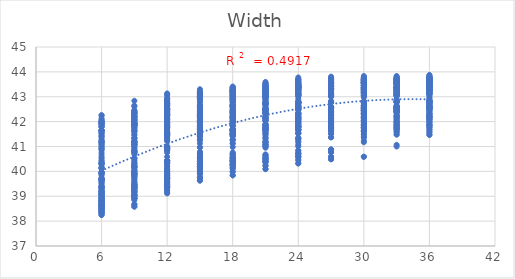
| Category | UTCI |
|---|---|
| 6.0 | 41.801 |
| 9.0 | 42.354 |
| 12.0 | 42.436 |
| 15.0 | 42.552 |
| 18.0 | 42.621 |
| 21.0 | 42.715 |
| 24.0 | 42.77 |
| 27.0 | 42.775 |
| 30.0 | 42.787 |
| 33.0 | 42.786 |
| 36.0 | 42.8 |
| 6.0 | 40.906 |
| 9.0 | 41.915 |
| 12.0 | 42.115 |
| 15.0 | 42.474 |
| 18.0 | 42.911 |
| 21.0 | 43.022 |
| 24.0 | 43.104 |
| 27.0 | 43.135 |
| 30.0 | 43.232 |
| 33.0 | 43.233 |
| 36.0 | 43.259 |
| 6.0 | 40.328 |
| 9.0 | 41.163 |
| 12.0 | 41.752 |
| 15.0 | 42.249 |
| 18.0 | 42.954 |
| 21.0 | 43.087 |
| 24.0 | 43.181 |
| 27.0 | 43.562 |
| 30.0 | 43.586 |
| 33.0 | 43.605 |
| 36.0 | 43.638 |
| 6.0 | 39.941 |
| 9.0 | 40.753 |
| 12.0 | 41.462 |
| 15.0 | 41.677 |
| 18.0 | 42.173 |
| 21.0 | 42.326 |
| 24.0 | 42.743 |
| 27.0 | 43.111 |
| 30.0 | 43.162 |
| 33.0 | 43.194 |
| 36.0 | 43.397 |
| 6.0 | 39.65 |
| 9.0 | 40.148 |
| 12.0 | 40.839 |
| 15.0 | 41.442 |
| 18.0 | 41.636 |
| 21.0 | 41.829 |
| 24.0 | 42.291 |
| 27.0 | 42.379 |
| 30.0 | 42.444 |
| 33.0 | 42.779 |
| 36.0 | 43.118 |
| 6.0 | 38.899 |
| 9.0 | 39.919 |
| 12.0 | 40.321 |
| 15.0 | 40.58 |
| 18.0 | 41.447 |
| 21.0 | 41.664 |
| 24.0 | 41.808 |
| 27.0 | 42.223 |
| 30.0 | 42.318 |
| 33.0 | 42.383 |
| 36.0 | 42.71 |
| 6.0 | 38.765 |
| 9.0 | 39.451 |
| 12.0 | 40.1 |
| 15.0 | 40.396 |
| 18.0 | 41.278 |
| 21.0 | 41.495 |
| 24.0 | 41.667 |
| 27.0 | 41.762 |
| 30.0 | 42.188 |
| 33.0 | 42.239 |
| 36.0 | 42.303 |
| 6.0 | 38.645 |
| 9.0 | 39.325 |
| 12.0 | 39.914 |
| 15.0 | 40.198 |
| 18.0 | 40.457 |
| 21.0 | 41.036 |
| 24.0 | 41.522 |
| 27.0 | 41.642 |
| 30.0 | 41.741 |
| 33.0 | 41.837 |
| 36.0 | 42.202 |
| 6.0 | 38.536 |
| 9.0 | 39.177 |
| 12.0 | 39.746 |
| 15.0 | 40.015 |
| 18.0 | 40.269 |
| 21.0 | 40.516 |
| 24.0 | 41.062 |
| 27.0 | 41.508 |
| 30.0 | 41.613 |
| 33.0 | 41.707 |
| 36.0 | 41.798 |
| 6.0 | 38.405 |
| 9.0 | 39.055 |
| 12.0 | 39.37 |
| 15.0 | 39.889 |
| 18.0 | 40.124 |
| 21.0 | 40.391 |
| 24.0 | 40.571 |
| 27.0 | 41.369 |
| 30.0 | 41.492 |
| 33.0 | 41.584 |
| 36.0 | 41.675 |
| 6.0 | 38.334 |
| 9.0 | 38.674 |
| 12.0 | 39.249 |
| 15.0 | 39.739 |
| 18.0 | 39.994 |
| 21.0 | 40.232 |
| 24.0 | 40.455 |
| 27.0 | 40.588 |
| 30.0 | 41.375 |
| 33.0 | 41.482 |
| 36.0 | 41.572 |
| 6.0 | 38.247 |
| 9.0 | 38.587 |
| 12.0 | 39.146 |
| 15.0 | 39.629 |
| 18.0 | 39.843 |
| 21.0 | 40.092 |
| 24.0 | 40.321 |
| 27.0 | 40.488 |
| 30.0 | 40.587 |
| 33.0 | 41.068 |
| 36.0 | 41.473 |
| 6.0 | 41.948 |
| 9.0 | 42.397 |
| 12.0 | 42.508 |
| 15.0 | 42.576 |
| 18.0 | 42.635 |
| 21.0 | 42.716 |
| 24.0 | 42.768 |
| 27.0 | 42.78 |
| 30.0 | 42.79 |
| 33.0 | 42.791 |
| 36.0 | 42.802 |
| 6.0 | 41.188 |
| 9.0 | 41.885 |
| 12.0 | 42.396 |
| 15.0 | 42.662 |
| 18.0 | 43.052 |
| 21.0 | 43.035 |
| 24.0 | 43.461 |
| 27.0 | 43.497 |
| 30.0 | 43.513 |
| 33.0 | 43.521 |
| 36.0 | 43.545 |
| 6.0 | 40.34 |
| 9.0 | 41.174 |
| 12.0 | 42.086 |
| 15.0 | 42.274 |
| 18.0 | 42.68 |
| 21.0 | 43.098 |
| 24.0 | 43.359 |
| 27.0 | 43.41 |
| 30.0 | 43.597 |
| 33.0 | 43.621 |
| 36.0 | 43.643 |
| 6.0 | 39.96 |
| 9.0 | 40.841 |
| 12.0 | 41.474 |
| 15.0 | 42.02 |
| 18.0 | 42.2 |
| 21.0 | 42.35 |
| 24.0 | 42.751 |
| 27.0 | 43.114 |
| 30.0 | 43.17 |
| 33.0 | 43.367 |
| 36.0 | 43.401 |
| 6.0 | 39.649 |
| 9.0 | 40.188 |
| 12.0 | 40.866 |
| 15.0 | 41.471 |
| 18.0 | 41.679 |
| 21.0 | 42.147 |
| 24.0 | 42.301 |
| 27.0 | 42.398 |
| 30.0 | 42.733 |
| 33.0 | 43.085 |
| 36.0 | 43.136 |
| 6.0 | 39.145 |
| 9.0 | 39.947 |
| 12.0 | 40.329 |
| 15.0 | 41.274 |
| 18.0 | 41.482 |
| 21.0 | 41.686 |
| 24.0 | 41.832 |
| 27.0 | 42.239 |
| 30.0 | 42.327 |
| 33.0 | 42.399 |
| 36.0 | 42.72 |
| 6.0 | 39.038 |
| 9.0 | 39.991 |
| 12.0 | 40.379 |
| 15.0 | 40.681 |
| 18.0 | 41.594 |
| 21.0 | 41.78 |
| 24.0 | 41.959 |
| 27.0 | 42.36 |
| 30.0 | 42.46 |
| 33.0 | 42.519 |
| 36.0 | 42.605 |
| 6.0 | 38.906 |
| 9.0 | 39.582 |
| 12.0 | 40.195 |
| 15.0 | 40.5 |
| 18.0 | 41.117 |
| 21.0 | 41.335 |
| 24.0 | 41.808 |
| 27.0 | 41.928 |
| 30.0 | 42.032 |
| 33.0 | 42.427 |
| 36.0 | 42.495 |
| 6.0 | 38.804 |
| 9.0 | 39.436 |
| 12.0 | 39.756 |
| 15.0 | 40.31 |
| 18.0 | 40.595 |
| 21.0 | 41.162 |
| 24.0 | 41.361 |
| 27.0 | 41.791 |
| 30.0 | 41.89 |
| 33.0 | 41.994 |
| 36.0 | 42.091 |
| 6.0 | 38.681 |
| 9.0 | 39.056 |
| 12.0 | 39.596 |
| 15.0 | 40.187 |
| 18.0 | 40.439 |
| 21.0 | 40.664 |
| 24.0 | 41.221 |
| 27.0 | 41.661 |
| 30.0 | 41.773 |
| 33.0 | 41.877 |
| 36.0 | 41.974 |
| 6.0 | 38.605 |
| 9.0 | 38.942 |
| 12.0 | 39.472 |
| 15.0 | 40.037 |
| 18.0 | 40.297 |
| 21.0 | 40.518 |
| 24.0 | 40.727 |
| 27.0 | 40.874 |
| 30.0 | 41.66 |
| 33.0 | 41.768 |
| 36.0 | 41.874 |
| 6.0 | 38.505 |
| 9.0 | 38.845 |
| 12.0 | 39.38 |
| 15.0 | 39.916 |
| 18.0 | 40.168 |
| 21.0 | 40.366 |
| 24.0 | 40.599 |
| 27.0 | 40.763 |
| 30.0 | 41.234 |
| 33.0 | 41.659 |
| 36.0 | 41.762 |
| 6.0 | 41.962 |
| 9.0 | 42.174 |
| 12.0 | 42.522 |
| 15.0 | 42.381 |
| 18.0 | 42.655 |
| 21.0 | 42.726 |
| 24.0 | 42.787 |
| 27.0 | 42.792 |
| 30.0 | 42.803 |
| 33.0 | 42.805 |
| 36.0 | 42.815 |
| 6.0 | 41.531 |
| 9.0 | 41.976 |
| 12.0 | 42.713 |
| 15.0 | 42.971 |
| 18.0 | 43.244 |
| 21.0 | 43.341 |
| 24.0 | 43.494 |
| 27.0 | 43.517 |
| 30.0 | 43.533 |
| 33.0 | 43.545 |
| 36.0 | 43.569 |
| 6.0 | 40.141 |
| 9.0 | 41.595 |
| 12.0 | 41.862 |
| 15.0 | 42.054 |
| 18.0 | 42.767 |
| 21.0 | 42.871 |
| 24.0 | 43.137 |
| 27.0 | 43.338 |
| 30.0 | 43.366 |
| 33.0 | 43.383 |
| 36.0 | 43.482 |
| 6.0 | 40.286 |
| 9.0 | 41.111 |
| 12.0 | 41.81 |
| 15.0 | 42.347 |
| 18.0 | 42.537 |
| 21.0 | 42.97 |
| 24.0 | 43.374 |
| 27.0 | 43.588 |
| 30.0 | 43.648 |
| 33.0 | 43.69 |
| 36.0 | 43.714 |
| 6.0 | 39.702 |
| 9.0 | 40.81 |
| 12.0 | 41.56 |
| 15.0 | 41.809 |
| 18.0 | 42.312 |
| 21.0 | 42.487 |
| 24.0 | 42.631 |
| 27.0 | 43.302 |
| 30.0 | 43.363 |
| 33.0 | 43.401 |
| 36.0 | 43.613 |
| 6.0 | 39.431 |
| 9.0 | 40.292 |
| 12.0 | 40.956 |
| 15.0 | 41.61 |
| 18.0 | 41.827 |
| 21.0 | 42.321 |
| 24.0 | 42.483 |
| 27.0 | 42.572 |
| 30.0 | 42.646 |
| 33.0 | 43.023 |
| 36.0 | 43.355 |
| 6.0 | 39.301 |
| 9.0 | 39.8 |
| 12.0 | 40.433 |
| 15.0 | 40.777 |
| 18.0 | 41.662 |
| 21.0 | 42.171 |
| 24.0 | 42.032 |
| 27.0 | 42.435 |
| 30.0 | 42.532 |
| 33.0 | 42.595 |
| 36.0 | 42.659 |
| 6.0 | 39.176 |
| 9.0 | 39.903 |
| 12.0 | 39.999 |
| 15.0 | 40.573 |
| 18.0 | 41.495 |
| 21.0 | 41.713 |
| 24.0 | 41.898 |
| 27.0 | 42.301 |
| 30.0 | 42.41 |
| 33.0 | 42.505 |
| 36.0 | 42.565 |
| 6.0 | 39.07 |
| 9.0 | 39.46 |
| 12.0 | 39.838 |
| 15.0 | 40.377 |
| 18.0 | 40.978 |
| 21.0 | 41.253 |
| 24.0 | 41.745 |
| 27.0 | 41.876 |
| 30.0 | 42.277 |
| 33.0 | 42.374 |
| 36.0 | 42.482 |
| 6.0 | 38.455 |
| 9.0 | 39.347 |
| 12.0 | 39.673 |
| 15.0 | 40.279 |
| 18.0 | 40.519 |
| 21.0 | 41.066 |
| 24.0 | 41.319 |
| 27.0 | 41.749 |
| 30.0 | 41.855 |
| 33.0 | 41.949 |
| 36.0 | 42.358 |
| 6.0 | 38.386 |
| 9.0 | 38.987 |
| 12.0 | 39.534 |
| 15.0 | 40.136 |
| 18.0 | 40.368 |
| 21.0 | 40.6 |
| 24.0 | 40.836 |
| 27.0 | 41.62 |
| 30.0 | 41.757 |
| 33.0 | 41.852 |
| 36.0 | 42.255 |
| 6.0 | 38.29 |
| 9.0 | 38.889 |
| 12.0 | 39.42 |
| 15.0 | 39.737 |
| 18.0 | 40.263 |
| 21.0 | 40.46 |
| 24.0 | 40.703 |
| 27.0 | 40.858 |
| 30.0 | 41.622 |
| 33.0 | 41.753 |
| 36.0 | 41.861 |
| 6.0 | 42.032 |
| 9.0 | 42.239 |
| 12.0 | 42.333 |
| 15.0 | 42.405 |
| 18.0 | 42.465 |
| 21.0 | 42.544 |
| 24.0 | 42.596 |
| 27.0 | 42.607 |
| 30.0 | 42.611 |
| 33.0 | 42.611 |
| 36.0 | 42.623 |
| 6.0 | 41.637 |
| 9.0 | 42.156 |
| 12.0 | 42.93 |
| 15.0 | 42.973 |
| 18.0 | 43.355 |
| 21.0 | 43.174 |
| 24.0 | 43.53 |
| 27.0 | 43.555 |
| 30.0 | 43.573 |
| 33.0 | 43.58 |
| 36.0 | 43.598 |
| 6.0 | 41.201 |
| 9.0 | 41.951 |
| 12.0 | 42.531 |
| 15.0 | 43.14 |
| 18.0 | 43.265 |
| 21.0 | 43.456 |
| 24.0 | 43.698 |
| 27.0 | 43.736 |
| 30.0 | 43.758 |
| 33.0 | 43.775 |
| 36.0 | 43.793 |
| 6.0 | 40.169 |
| 9.0 | 41.068 |
| 12.0 | 41.973 |
| 15.0 | 42.201 |
| 18.0 | 42.801 |
| 21.0 | 43.25 |
| 24.0 | 43.36 |
| 27.0 | 43.415 |
| 30.0 | 43.454 |
| 33.0 | 43.548 |
| 36.0 | 43.73 |
| 6.0 | 39.892 |
| 9.0 | 40.79 |
| 12.0 | 41.749 |
| 15.0 | 41.984 |
| 18.0 | 42.186 |
| 21.0 | 42.627 |
| 24.0 | 43.043 |
| 27.0 | 43.306 |
| 30.0 | 43.345 |
| 33.0 | 43.388 |
| 36.0 | 43.424 |
| 6.0 | 39.363 |
| 9.0 | 40.528 |
| 12.0 | 40.863 |
| 15.0 | 41.811 |
| 18.0 | 42.003 |
| 21.0 | 42.219 |
| 24.0 | 42.338 |
| 27.0 | 42.998 |
| 30.0 | 43.24 |
| 33.0 | 43.308 |
| 36.0 | 43.333 |
| 6.0 | 39.19 |
| 9.0 | 40.229 |
| 12.0 | 40.913 |
| 15.0 | 41.586 |
| 18.0 | 42.127 |
| 21.0 | 42.325 |
| 24.0 | 42.49 |
| 27.0 | 42.569 |
| 30.0 | 42.649 |
| 33.0 | 43.143 |
| 36.0 | 43.508 |
| 6.0 | 39.032 |
| 9.0 | 40.065 |
| 12.0 | 40.424 |
| 15.0 | 41.412 |
| 18.0 | 41.659 |
| 21.0 | 41.874 |
| 24.0 | 42.346 |
| 27.0 | 42.457 |
| 30.0 | 42.547 |
| 33.0 | 42.625 |
| 36.0 | 42.958 |
| 6.0 | 38.918 |
| 9.0 | 39.907 |
| 12.0 | 40 |
| 15.0 | 40.56 |
| 18.0 | 41.504 |
| 21.0 | 41.73 |
| 24.0 | 42.216 |
| 27.0 | 42.345 |
| 30.0 | 42.435 |
| 33.0 | 42.528 |
| 36.0 | 42.607 |
| 6.0 | 38.795 |
| 9.0 | 39.487 |
| 12.0 | 39.856 |
| 15.0 | 40.426 |
| 18.0 | 40.708 |
| 21.0 | 41.606 |
| 24.0 | 41.782 |
| 27.0 | 42.223 |
| 30.0 | 42.328 |
| 33.0 | 42.424 |
| 36.0 | 42.514 |
| 6.0 | 38.722 |
| 9.0 | 39.35 |
| 12.0 | 39.722 |
| 15.0 | 40.289 |
| 18.0 | 40.548 |
| 21.0 | 41.168 |
| 24.0 | 41.666 |
| 27.0 | 42.11 |
| 30.0 | 42.228 |
| 33.0 | 42.331 |
| 36.0 | 42.419 |
| 6.0 | 38.63 |
| 9.0 | 39.233 |
| 12.0 | 39.361 |
| 15.0 | 40.18 |
| 18.0 | 40.409 |
| 21.0 | 41.017 |
| 24.0 | 41.543 |
| 27.0 | 41.704 |
| 30.0 | 42.108 |
| 33.0 | 42.226 |
| 36.0 | 42.325 |
| 6.0 | 42.021 |
| 9.0 | 41.854 |
| 12.0 | 42.279 |
| 15.0 | 41.96 |
| 18.0 | 42.429 |
| 21.0 | 42.481 |
| 24.0 | 42.537 |
| 27.0 | 42.539 |
| 30.0 | 42.54 |
| 33.0 | 42.541 |
| 36.0 | 42.558 |
| 6.0 | 42.246 |
| 9.0 | 42.128 |
| 12.0 | 42.243 |
| 15.0 | 43.008 |
| 18.0 | 43.16 |
| 21.0 | 43.231 |
| 24.0 | 43.306 |
| 27.0 | 43.325 |
| 30.0 | 43.341 |
| 33.0 | 43.337 |
| 36.0 | 43.357 |
| 6.0 | 41.037 |
| 9.0 | 42.44 |
| 12.0 | 43.132 |
| 15.0 | 43.302 |
| 18.0 | 43.411 |
| 21.0 | 43.541 |
| 24.0 | 43.776 |
| 27.0 | 43.81 |
| 30.0 | 43.834 |
| 33.0 | 43.835 |
| 36.0 | 43.855 |
| 6.0 | 40.417 |
| 9.0 | 41.894 |
| 12.0 | 42.3 |
| 15.0 | 43.118 |
| 18.0 | 43.288 |
| 21.0 | 43.435 |
| 24.0 | 43.548 |
| 27.0 | 43.747 |
| 30.0 | 43.772 |
| 33.0 | 43.786 |
| 36.0 | 43.808 |
| 6.0 | 40.137 |
| 9.0 | 41.63 |
| 12.0 | 41.946 |
| 15.0 | 42.315 |
| 18.0 | 43.13 |
| 21.0 | 43.31 |
| 24.0 | 43.438 |
| 27.0 | 43.506 |
| 30.0 | 43.537 |
| 33.0 | 43.563 |
| 36.0 | 43.753 |
| 6.0 | 39.323 |
| 9.0 | 41.051 |
| 12.0 | 41.777 |
| 15.0 | 42.005 |
| 18.0 | 42.357 |
| 21.0 | 43.212 |
| 24.0 | 43.318 |
| 27.0 | 43.402 |
| 30.0 | 43.463 |
| 33.0 | 43.501 |
| 36.0 | 43.519 |
| 6.0 | 39.143 |
| 9.0 | 40.299 |
| 12.0 | 41.591 |
| 15.0 | 41.86 |
| 18.0 | 42.116 |
| 21.0 | 42.807 |
| 24.0 | 43.251 |
| 27.0 | 43.296 |
| 30.0 | 43.373 |
| 33.0 | 43.404 |
| 36.0 | 43.45 |
| 6.0 | 38.979 |
| 9.0 | 39.822 |
| 12.0 | 41.41 |
| 15.0 | 41.71 |
| 18.0 | 41.948 |
| 21.0 | 42.399 |
| 24.0 | 42.57 |
| 27.0 | 43.231 |
| 30.0 | 43.286 |
| 33.0 | 43.342 |
| 36.0 | 43.378 |
| 6.0 | 38.855 |
| 9.0 | 39.364 |
| 12.0 | 40.929 |
| 15.0 | 41.538 |
| 18.0 | 41.84 |
| 21.0 | 42.114 |
| 24.0 | 42.453 |
| 27.0 | 42.567 |
| 30.0 | 43.206 |
| 33.0 | 43.263 |
| 36.0 | 43.319 |
| 6.0 | 38.704 |
| 9.0 | 39.212 |
| 12.0 | 39.894 |
| 15.0 | 41.426 |
| 18.0 | 41.711 |
| 21.0 | 42.02 |
| 24.0 | 42.2 |
| 27.0 | 42.467 |
| 30.0 | 42.55 |
| 33.0 | 42.896 |
| 36.0 | 43.247 |
| 6.0 | 38.613 |
| 9.0 | 39.059 |
| 12.0 | 39.451 |
| 15.0 | 40.962 |
| 18.0 | 41.551 |
| 21.0 | 41.895 |
| 24.0 | 42.104 |
| 27.0 | 42.377 |
| 30.0 | 42.477 |
| 33.0 | 42.551 |
| 36.0 | 42.901 |
| 6.0 | 38.501 |
| 9.0 | 38.943 |
| 12.0 | 39.346 |
| 15.0 | 40.203 |
| 18.0 | 41.454 |
| 21.0 | 41.771 |
| 24.0 | 41.994 |
| 27.0 | 42.298 |
| 30.0 | 42.366 |
| 33.0 | 42.46 |
| 36.0 | 42.546 |
| 6.0 | 41.661 |
| 9.0 | 41.851 |
| 12.0 | 41.919 |
| 15.0 | 41.981 |
| 18.0 | 42.038 |
| 21.0 | 42.123 |
| 24.0 | 42.17 |
| 27.0 | 42.17 |
| 30.0 | 42.17 |
| 33.0 | 42.173 |
| 36.0 | 42.185 |
| 6.0 | 41.864 |
| 9.0 | 42.043 |
| 12.0 | 42.437 |
| 15.0 | 42.237 |
| 18.0 | 42.602 |
| 21.0 | 42.426 |
| 24.0 | 42.763 |
| 27.0 | 42.778 |
| 30.0 | 42.791 |
| 33.0 | 42.786 |
| 36.0 | 42.797 |
| 6.0 | 41.941 |
| 9.0 | 42.294 |
| 12.0 | 42.639 |
| 15.0 | 42.763 |
| 18.0 | 42.863 |
| 21.0 | 42.962 |
| 24.0 | 43.027 |
| 27.0 | 43.058 |
| 30.0 | 43.065 |
| 33.0 | 43.068 |
| 36.0 | 43.076 |
| 6.0 | 41.635 |
| 9.0 | 42.647 |
| 12.0 | 42.868 |
| 15.0 | 43.021 |
| 18.0 | 43.156 |
| 21.0 | 43.435 |
| 24.0 | 43.519 |
| 27.0 | 43.554 |
| 30.0 | 43.565 |
| 33.0 | 43.571 |
| 36.0 | 43.592 |
| 6.0 | 41.404 |
| 9.0 | 42.189 |
| 12.0 | 42.736 |
| 15.0 | 42.906 |
| 18.0 | 43.05 |
| 21.0 | 43.184 |
| 24.0 | 43.29 |
| 27.0 | 43.506 |
| 30.0 | 43.514 |
| 33.0 | 43.533 |
| 36.0 | 43.55 |
| 6.0 | 41.13 |
| 9.0 | 41.757 |
| 12.0 | 42.812 |
| 15.0 | 43.021 |
| 18.0 | 43.17 |
| 21.0 | 43.336 |
| 24.0 | 43.427 |
| 27.0 | 43.484 |
| 30.0 | 43.679 |
| 33.0 | 43.711 |
| 36.0 | 43.721 |
| 6.0 | 40.931 |
| 9.0 | 41.751 |
| 12.0 | 42.658 |
| 15.0 | 43.175 |
| 18.0 | 43.364 |
| 21.0 | 43.52 |
| 24.0 | 43.639 |
| 27.0 | 43.688 |
| 30.0 | 43.728 |
| 33.0 | 43.745 |
| 36.0 | 43.789 |
| 6.0 | 40.735 |
| 9.0 | 41.346 |
| 12.0 | 42.524 |
| 15.0 | 43.068 |
| 18.0 | 43.257 |
| 21.0 | 43.434 |
| 24.0 | 43.569 |
| 27.0 | 43.639 |
| 30.0 | 43.676 |
| 33.0 | 43.72 |
| 36.0 | 43.743 |
| 6.0 | 39.908 |
| 9.0 | 41.205 |
| 12.0 | 41.836 |
| 15.0 | 42.915 |
| 18.0 | 43.172 |
| 21.0 | 43.343 |
| 24.0 | 43.489 |
| 27.0 | 43.576 |
| 30.0 | 43.62 |
| 33.0 | 43.669 |
| 36.0 | 43.715 |
| 6.0 | 39.702 |
| 9.0 | 41.049 |
| 12.0 | 41.703 |
| 15.0 | 42.262 |
| 18.0 | 43.072 |
| 21.0 | 43.279 |
| 24.0 | 43.425 |
| 27.0 | 43.519 |
| 30.0 | 43.571 |
| 33.0 | 43.621 |
| 36.0 | 43.669 |
| 6.0 | 39.558 |
| 9.0 | 40.532 |
| 12.0 | 41.588 |
| 15.0 | 42.149 |
| 18.0 | 42.38 |
| 21.0 | 43.19 |
| 24.0 | 43.362 |
| 27.0 | 43.454 |
| 30.0 | 43.535 |
| 33.0 | 43.578 |
| 36.0 | 43.628 |
| 6.0 | 39.41 |
| 9.0 | 40.388 |
| 12.0 | 41.216 |
| 15.0 | 42.051 |
| 18.0 | 42.287 |
| 21.0 | 42.809 |
| 24.0 | 43.288 |
| 27.0 | 43.403 |
| 30.0 | 43.449 |
| 33.0 | 43.535 |
| 36.0 | 43.585 |
| 6.0 | 41.628 |
| 9.0 | 41.867 |
| 12.0 | 41.869 |
| 15.0 | 41.959 |
| 18.0 | 42.01 |
| 21.0 | 42.083 |
| 24.0 | 42.15 |
| 27.0 | 42.146 |
| 30.0 | 42.151 |
| 33.0 | 42.147 |
| 36.0 | 42.163 |
| 6.0 | 41.783 |
| 9.0 | 41.841 |
| 12.0 | 42.234 |
| 15.0 | 42.317 |
| 18.0 | 42.41 |
| 21.0 | 42.489 |
| 24.0 | 42.568 |
| 27.0 | 42.569 |
| 30.0 | 42.594 |
| 33.0 | 42.587 |
| 36.0 | 42.592 |
| 6.0 | 41.525 |
| 9.0 | 41.684 |
| 12.0 | 42.288 |
| 15.0 | 42.215 |
| 18.0 | 42.599 |
| 21.0 | 42.449 |
| 24.0 | 42.746 |
| 27.0 | 42.557 |
| 30.0 | 42.769 |
| 33.0 | 42.555 |
| 36.0 | 42.778 |
| 6.0 | 41.859 |
| 9.0 | 42.305 |
| 12.0 | 42.742 |
| 15.0 | 42.899 |
| 18.0 | 43.009 |
| 21.0 | 43.178 |
| 24.0 | 43.282 |
| 27.0 | 43.29 |
| 30.0 | 43.296 |
| 33.0 | 43.304 |
| 36.0 | 43.325 |
| 6.0 | 41.417 |
| 9.0 | 42.185 |
| 12.0 | 42.336 |
| 15.0 | 42.816 |
| 18.0 | 42.933 |
| 21.0 | 43.037 |
| 24.0 | 43.151 |
| 27.0 | 43.274 |
| 30.0 | 43.276 |
| 33.0 | 43.278 |
| 36.0 | 43.291 |
| 6.0 | 41.26 |
| 9.0 | 42.057 |
| 12.0 | 42.259 |
| 15.0 | 42.448 |
| 18.0 | 42.879 |
| 21.0 | 43.016 |
| 24.0 | 43.109 |
| 27.0 | 43.139 |
| 30.0 | 43.161 |
| 33.0 | 43.197 |
| 36.0 | 43.281 |
| 6.0 | 41.126 |
| 9.0 | 41.934 |
| 12.0 | 42.148 |
| 15.0 | 42.386 |
| 18.0 | 42.845 |
| 21.0 | 42.985 |
| 24.0 | 43.09 |
| 27.0 | 43.098 |
| 30.0 | 43.128 |
| 33.0 | 43.146 |
| 36.0 | 43.25 |
| 6.0 | 40.982 |
| 9.0 | 41.835 |
| 12.0 | 42.062 |
| 15.0 | 42.306 |
| 18.0 | 42.462 |
| 21.0 | 42.934 |
| 24.0 | 43.063 |
| 27.0 | 43.084 |
| 30.0 | 43.101 |
| 33.0 | 43.134 |
| 36.0 | 43.224 |
| 6.0 | 40.531 |
| 9.0 | 41.464 |
| 12.0 | 41.969 |
| 15.0 | 42.21 |
| 18.0 | 42.393 |
| 21.0 | 42.544 |
| 24.0 | 42.69 |
| 27.0 | 43.046 |
| 30.0 | 43.073 |
| 33.0 | 43.106 |
| 36.0 | 43.221 |
| 6.0 | 39.839 |
| 9.0 | 41.34 |
| 12.0 | 41.875 |
| 15.0 | 42.169 |
| 18.0 | 42.335 |
| 21.0 | 42.522 |
| 24.0 | 42.652 |
| 27.0 | 43.021 |
| 30.0 | 43.035 |
| 33.0 | 43.078 |
| 36.0 | 43.19 |
| 6.0 | 39.718 |
| 9.0 | 41.21 |
| 12.0 | 41.527 |
| 15.0 | 42.094 |
| 18.0 | 42.256 |
| 21.0 | 42.453 |
| 24.0 | 42.618 |
| 27.0 | 42.82 |
| 30.0 | 43.027 |
| 33.0 | 43.054 |
| 36.0 | 43.164 |
| 6.0 | 39.565 |
| 9.0 | 41.1 |
| 12.0 | 41.469 |
| 15.0 | 41.756 |
| 18.0 | 42.207 |
| 21.0 | 42.382 |
| 24.0 | 42.571 |
| 27.0 | 42.784 |
| 30.0 | 42.973 |
| 33.0 | 43.029 |
| 36.0 | 43.139 |
| 6.0 | 41.646 |
| 9.0 | 41.902 |
| 12.0 | 41.975 |
| 15.0 | 42.038 |
| 18.0 | 42.096 |
| 21.0 | 42.18 |
| 24.0 | 42.231 |
| 27.0 | 42.23 |
| 30.0 | 42.23 |
| 33.0 | 42.235 |
| 36.0 | 42.249 |
| 6.0 | 42.079 |
| 9.0 | 42.24 |
| 12.0 | 42.636 |
| 15.0 | 42.44 |
| 18.0 | 42.87 |
| 21.0 | 42.696 |
| 24.0 | 43.039 |
| 27.0 | 43.051 |
| 30.0 | 43.064 |
| 33.0 | 43.06 |
| 36.0 | 43.069 |
| 6.0 | 42.124 |
| 9.0 | 42.461 |
| 12.0 | 42.8 |
| 15.0 | 42.921 |
| 18.0 | 43.022 |
| 21.0 | 43.116 |
| 24.0 | 43.185 |
| 27.0 | 43.284 |
| 30.0 | 43.29 |
| 33.0 | 43.292 |
| 36.0 | 43.298 |
| 6.0 | 41.534 |
| 9.0 | 42.836 |
| 12.0 | 43.047 |
| 15.0 | 43.185 |
| 18.0 | 43.314 |
| 21.0 | 43.595 |
| 24.0 | 43.686 |
| 27.0 | 43.716 |
| 30.0 | 43.724 |
| 33.0 | 43.729 |
| 36.0 | 43.75 |
| 6.0 | 41.32 |
| 9.0 | 42.068 |
| 12.0 | 42.931 |
| 15.0 | 43.089 |
| 18.0 | 43.222 |
| 21.0 | 43.345 |
| 24.0 | 43.454 |
| 27.0 | 43.673 |
| 30.0 | 43.679 |
| 33.0 | 43.697 |
| 36.0 | 43.71 |
| 6.0 | 40.834 |
| 9.0 | 41.656 |
| 12.0 | 42.501 |
| 15.0 | 43.011 |
| 18.0 | 43.148 |
| 21.0 | 43.303 |
| 24.0 | 43.389 |
| 27.0 | 43.437 |
| 30.0 | 43.639 |
| 33.0 | 43.668 |
| 36.0 | 43.676 |
| 6.0 | 40.655 |
| 9.0 | 41.485 |
| 12.0 | 42.356 |
| 15.0 | 43.185 |
| 18.0 | 43.374 |
| 21.0 | 43.516 |
| 24.0 | 43.632 |
| 27.0 | 43.663 |
| 30.0 | 43.702 |
| 33.0 | 43.716 |
| 36.0 | 43.756 |
| 6.0 | 40.454 |
| 9.0 | 41.099 |
| 12.0 | 42.233 |
| 15.0 | 43.086 |
| 18.0 | 43.267 |
| 21.0 | 43.442 |
| 24.0 | 43.574 |
| 27.0 | 43.622 |
| 30.0 | 43.657 |
| 33.0 | 43.695 |
| 36.0 | 43.714 |
| 6.0 | 39.612 |
| 9.0 | 40.953 |
| 12.0 | 41.575 |
| 15.0 | 42.636 |
| 18.0 | 43.189 |
| 21.0 | 43.355 |
| 24.0 | 43.5 |
| 27.0 | 43.567 |
| 30.0 | 43.606 |
| 33.0 | 43.65 |
| 36.0 | 43.693 |
| 6.0 | 39.395 |
| 9.0 | 40.788 |
| 12.0 | 41.447 |
| 15.0 | 41.988 |
| 18.0 | 43.095 |
| 21.0 | 43.294 |
| 24.0 | 43.439 |
| 27.0 | 43.516 |
| 30.0 | 43.561 |
| 33.0 | 43.602 |
| 36.0 | 43.65 |
| 6.0 | 39.253 |
| 9.0 | 40.325 |
| 12.0 | 41.328 |
| 15.0 | 41.882 |
| 18.0 | 42.107 |
| 21.0 | 42.901 |
| 24.0 | 43.375 |
| 27.0 | 43.448 |
| 30.0 | 43.521 |
| 33.0 | 43.564 |
| 36.0 | 43.61 |
| 6.0 | 39.101 |
| 9.0 | 40.178 |
| 12.0 | 40.974 |
| 15.0 | 41.796 |
| 18.0 | 42.016 |
| 21.0 | 42.509 |
| 24.0 | 43.304 |
| 27.0 | 43.4 |
| 30.0 | 43.443 |
| 33.0 | 43.519 |
| 36.0 | 43.568 |
| 6.0 | 41.967 |
| 9.0 | 41.805 |
| 12.0 | 42.3 |
| 15.0 | 41.981 |
| 18.0 | 42.447 |
| 21.0 | 42.511 |
| 24.0 | 42.561 |
| 27.0 | 42.564 |
| 30.0 | 42.564 |
| 33.0 | 42.569 |
| 36.0 | 42.584 |
| 6.0 | 42.259 |
| 9.0 | 42.069 |
| 12.0 | 42.732 |
| 15.0 | 42.945 |
| 18.0 | 43.089 |
| 21.0 | 43.179 |
| 24.0 | 43.239 |
| 27.0 | 43.335 |
| 30.0 | 43.35 |
| 33.0 | 43.347 |
| 36.0 | 43.366 |
| 6.0 | 41.421 |
| 9.0 | 42.605 |
| 12.0 | 43.095 |
| 15.0 | 43.224 |
| 18.0 | 43.325 |
| 21.0 | 43.468 |
| 24.0 | 43.702 |
| 27.0 | 43.736 |
| 30.0 | 43.76 |
| 33.0 | 43.757 |
| 36.0 | 43.776 |
| 6.0 | 41.068 |
| 9.0 | 42.078 |
| 12.0 | 42.632 |
| 15.0 | 43.058 |
| 18.0 | 43.216 |
| 21.0 | 43.369 |
| 24.0 | 43.469 |
| 27.0 | 43.676 |
| 30.0 | 43.7 |
| 33.0 | 43.714 |
| 36.0 | 43.74 |
| 6.0 | 40.102 |
| 9.0 | 41.345 |
| 12.0 | 42.153 |
| 15.0 | 42.327 |
| 18.0 | 43.07 |
| 21.0 | 43.257 |
| 24.0 | 43.376 |
| 27.0 | 43.433 |
| 30.0 | 43.459 |
| 33.0 | 43.489 |
| 36.0 | 43.514 |
| 6.0 | 39.333 |
| 9.0 | 40.793 |
| 12.0 | 41.508 |
| 15.0 | 41.724 |
| 18.0 | 42.367 |
| 21.0 | 43.166 |
| 24.0 | 43.269 |
| 27.0 | 43.339 |
| 30.0 | 43.395 |
| 33.0 | 43.431 |
| 36.0 | 43.448 |
| 6.0 | 39.128 |
| 9.0 | 40.515 |
| 12.0 | 41.308 |
| 15.0 | 41.587 |
| 18.0 | 41.954 |
| 21.0 | 42.772 |
| 24.0 | 42.918 |
| 27.0 | 43.244 |
| 30.0 | 43.313 |
| 33.0 | 43.343 |
| 36.0 | 43.379 |
| 6.0 | 38.958 |
| 9.0 | 39.899 |
| 12.0 | 40.752 |
| 15.0 | 41.43 |
| 18.0 | 41.672 |
| 21.0 | 42.361 |
| 24.0 | 42.815 |
| 27.0 | 43.18 |
| 30.0 | 43.234 |
| 33.0 | 43.289 |
| 36.0 | 43.321 |
| 6.0 | 38.827 |
| 9.0 | 39.364 |
| 12.0 | 40.583 |
| 15.0 | 41.25 |
| 18.0 | 41.532 |
| 21.0 | 41.777 |
| 24.0 | 42.102 |
| 27.0 | 42.516 |
| 30.0 | 43.156 |
| 33.0 | 43.215 |
| 36.0 | 43.266 |
| 6.0 | 38.669 |
| 9.0 | 39.187 |
| 12.0 | 40.407 |
| 15.0 | 41.127 |
| 18.0 | 41.408 |
| 21.0 | 41.692 |
| 24.0 | 41.859 |
| 27.0 | 42.118 |
| 30.0 | 42.502 |
| 33.0 | 42.86 |
| 36.0 | 43.198 |
| 6.0 | 38.588 |
| 9.0 | 39.04 |
| 12.0 | 39.973 |
| 15.0 | 40.972 |
| 18.0 | 41.264 |
| 21.0 | 41.561 |
| 24.0 | 41.777 |
| 27.0 | 42.037 |
| 30.0 | 42.439 |
| 33.0 | 42.504 |
| 36.0 | 42.857 |
| 6.0 | 38.493 |
| 9.0 | 38.919 |
| 12.0 | 39.855 |
| 15.0 | 40.196 |
| 18.0 | 41.135 |
| 21.0 | 41.433 |
| 24.0 | 41.664 |
| 27.0 | 41.964 |
| 30.0 | 42.028 |
| 33.0 | 42.425 |
| 36.0 | 42.5 |
| 6.0 | 41.902 |
| 9.0 | 42.394 |
| 12.0 | 42.545 |
| 15.0 | 42.618 |
| 18.0 | 42.678 |
| 21.0 | 42.767 |
| 24.0 | 42.811 |
| 27.0 | 42.822 |
| 30.0 | 42.825 |
| 33.0 | 42.831 |
| 36.0 | 42.844 |
| 6.0 | 41.631 |
| 9.0 | 42.196 |
| 12.0 | 42.899 |
| 15.0 | 42.908 |
| 18.0 | 43.275 |
| 21.0 | 43.12 |
| 24.0 | 43.45 |
| 27.0 | 43.546 |
| 30.0 | 43.564 |
| 33.0 | 43.572 |
| 36.0 | 43.587 |
| 6.0 | 40.574 |
| 9.0 | 41.965 |
| 12.0 | 42.501 |
| 15.0 | 43.131 |
| 18.0 | 43.261 |
| 21.0 | 43.377 |
| 24.0 | 43.62 |
| 27.0 | 43.66 |
| 30.0 | 43.681 |
| 33.0 | 43.699 |
| 36.0 | 43.715 |
| 6.0 | 39.951 |
| 9.0 | 40.976 |
| 12.0 | 41.662 |
| 15.0 | 42.191 |
| 18.0 | 42.942 |
| 21.0 | 43.25 |
| 24.0 | 43.349 |
| 27.0 | 43.403 |
| 30.0 | 43.438 |
| 33.0 | 43.462 |
| 36.0 | 43.658 |
| 6.0 | 39.656 |
| 9.0 | 40.69 |
| 12.0 | 41.427 |
| 15.0 | 41.676 |
| 18.0 | 42.183 |
| 21.0 | 42.647 |
| 24.0 | 43.05 |
| 27.0 | 43.303 |
| 30.0 | 43.338 |
| 33.0 | 43.379 |
| 36.0 | 43.41 |
| 6.0 | 39.353 |
| 9.0 | 40.438 |
| 12.0 | 40.916 |
| 15.0 | 41.497 |
| 18.0 | 41.703 |
| 21.0 | 42.223 |
| 24.0 | 42.342 |
| 27.0 | 43.008 |
| 30.0 | 43.243 |
| 33.0 | 43.307 |
| 36.0 | 43.332 |
| 6.0 | 39.209 |
| 9.0 | 40.192 |
| 12.0 | 40.97 |
| 15.0 | 41.578 |
| 18.0 | 41.842 |
| 21.0 | 42.048 |
| 24.0 | 42.514 |
| 27.0 | 42.591 |
| 30.0 | 42.673 |
| 33.0 | 43.179 |
| 36.0 | 43.53 |
| 6.0 | 39.058 |
| 9.0 | 40.009 |
| 12.0 | 40.426 |
| 15.0 | 41.411 |
| 18.0 | 41.651 |
| 21.0 | 41.903 |
| 24.0 | 42.071 |
| 27.0 | 42.177 |
| 30.0 | 42.567 |
| 33.0 | 42.652 |
| 36.0 | 42.998 |
| 6.0 | 38.926 |
| 9.0 | 39.876 |
| 12.0 | 40.009 |
| 15.0 | 40.544 |
| 18.0 | 41.511 |
| 21.0 | 41.737 |
| 24.0 | 41.945 |
| 27.0 | 42.072 |
| 30.0 | 42.155 |
| 33.0 | 42.556 |
| 36.0 | 42.636 |
| 6.0 | 38.789 |
| 9.0 | 39.494 |
| 12.0 | 39.846 |
| 15.0 | 40.422 |
| 18.0 | 40.703 |
| 21.0 | 41.609 |
| 24.0 | 41.795 |
| 27.0 | 41.959 |
| 30.0 | 42.057 |
| 33.0 | 42.46 |
| 36.0 | 42.543 |
| 6.0 | 38.702 |
| 9.0 | 39.362 |
| 12.0 | 39.708 |
| 15.0 | 40.273 |
| 18.0 | 40.534 |
| 21.0 | 41.109 |
| 24.0 | 41.675 |
| 27.0 | 41.836 |
| 30.0 | 41.967 |
| 33.0 | 42.064 |
| 36.0 | 42.151 |
| 6.0 | 38.622 |
| 9.0 | 39.251 |
| 12.0 | 39.371 |
| 15.0 | 40.149 |
| 18.0 | 40.406 |
| 21.0 | 40.951 |
| 24.0 | 41.56 |
| 27.0 | 41.723 |
| 30.0 | 41.833 |
| 33.0 | 41.969 |
| 36.0 | 42.063 |
| 6.0 | 41.959 |
| 9.0 | 42.368 |
| 12.0 | 42.498 |
| 15.0 | 42.595 |
| 18.0 | 42.658 |
| 21.0 | 42.73 |
| 24.0 | 42.791 |
| 27.0 | 42.796 |
| 30.0 | 42.807 |
| 33.0 | 42.809 |
| 36.0 | 42.818 |
| 6.0 | 41.208 |
| 9.0 | 41.946 |
| 12.0 | 42.674 |
| 15.0 | 42.946 |
| 18.0 | 43.23 |
| 21.0 | 43.33 |
| 24.0 | 43.411 |
| 27.0 | 43.434 |
| 30.0 | 43.522 |
| 33.0 | 43.534 |
| 36.0 | 43.556 |
| 6.0 | 40.132 |
| 9.0 | 41.281 |
| 12.0 | 41.525 |
| 15.0 | 42.039 |
| 18.0 | 42.761 |
| 21.0 | 43.017 |
| 24.0 | 43.113 |
| 27.0 | 43.325 |
| 30.0 | 43.355 |
| 33.0 | 43.373 |
| 36.0 | 43.399 |
| 6.0 | 40.278 |
| 9.0 | 41.196 |
| 12.0 | 41.781 |
| 15.0 | 42.354 |
| 18.0 | 42.537 |
| 21.0 | 42.984 |
| 24.0 | 43.388 |
| 27.0 | 43.589 |
| 30.0 | 43.643 |
| 33.0 | 43.685 |
| 36.0 | 43.875 |
| 6.0 | 39.731 |
| 9.0 | 40.902 |
| 12.0 | 41.247 |
| 15.0 | 41.81 |
| 18.0 | 42.018 |
| 21.0 | 42.492 |
| 24.0 | 42.634 |
| 27.0 | 43.316 |
| 30.0 | 43.375 |
| 33.0 | 43.57 |
| 36.0 | 43.452 |
| 6.0 | 39.509 |
| 9.0 | 40.037 |
| 12.0 | 41.015 |
| 15.0 | 41.613 |
| 18.0 | 41.83 |
| 21.0 | 42.034 |
| 24.0 | 42.487 |
| 27.0 | 42.574 |
| 30.0 | 42.653 |
| 33.0 | 43.04 |
| 36.0 | 43.366 |
| 6.0 | 39.353 |
| 9.0 | 39.824 |
| 12.0 | 40.44 |
| 15.0 | 40.779 |
| 18.0 | 41.667 |
| 21.0 | 41.874 |
| 24.0 | 42.05 |
| 27.0 | 42.137 |
| 30.0 | 42.53 |
| 33.0 | 42.605 |
| 36.0 | 42.668 |
| 6.0 | 39.209 |
| 9.0 | 39.683 |
| 12.0 | 40.008 |
| 15.0 | 40.58 |
| 18.0 | 41.496 |
| 21.0 | 41.711 |
| 24.0 | 41.896 |
| 27.0 | 42.014 |
| 30.0 | 42.115 |
| 33.0 | 42.514 |
| 36.0 | 42.565 |
| 6.0 | 39.078 |
| 9.0 | 39.547 |
| 12.0 | 39.855 |
| 15.0 | 40.385 |
| 18.0 | 40.678 |
| 21.0 | 41.185 |
| 24.0 | 41.743 |
| 27.0 | 41.88 |
| 30.0 | 41.986 |
| 33.0 | 42.089 |
| 36.0 | 42.182 |
| 6.0 | 38.455 |
| 9.0 | 39.413 |
| 12.0 | 39.704 |
| 15.0 | 40.264 |
| 18.0 | 40.53 |
| 21.0 | 41.066 |
| 24.0 | 41.322 |
| 27.0 | 41.75 |
| 30.0 | 41.858 |
| 33.0 | 41.978 |
| 36.0 | 42.07 |
| 6.0 | 38.411 |
| 9.0 | 39.034 |
| 12.0 | 39.589 |
| 15.0 | 40.123 |
| 18.0 | 40.371 |
| 21.0 | 40.61 |
| 24.0 | 40.839 |
| 27.0 | 41.631 |
| 30.0 | 41.753 |
| 33.0 | 41.864 |
| 36.0 | 41.963 |
| 6.0 | 38.34 |
| 9.0 | 38.922 |
| 12.0 | 39.506 |
| 15.0 | 39.756 |
| 18.0 | 40.248 |
| 21.0 | 40.462 |
| 24.0 | 40.696 |
| 27.0 | 40.86 |
| 30.0 | 41.62 |
| 33.0 | 41.757 |
| 36.0 | 41.867 |
| 6.0 | 41.952 |
| 9.0 | 42.327 |
| 12.0 | 42.497 |
| 15.0 | 42.579 |
| 18.0 | 42.644 |
| 21.0 | 42.718 |
| 24.0 | 42.775 |
| 27.0 | 42.783 |
| 30.0 | 42.796 |
| 33.0 | 42.799 |
| 36.0 | 42.81 |
| 6.0 | 41.177 |
| 9.0 | 41.581 |
| 12.0 | 42.363 |
| 15.0 | 42.66 |
| 18.0 | 43.201 |
| 21.0 | 43.039 |
| 24.0 | 43.384 |
| 27.0 | 43.414 |
| 30.0 | 43.437 |
| 33.0 | 43.51 |
| 36.0 | 43.531 |
| 6.0 | 40.35 |
| 9.0 | 41.172 |
| 12.0 | 41.779 |
| 15.0 | 42.275 |
| 18.0 | 42.991 |
| 21.0 | 43.108 |
| 24.0 | 43.361 |
| 27.0 | 43.404 |
| 30.0 | 43.604 |
| 33.0 | 43.629 |
| 36.0 | 43.654 |
| 6.0 | 39.966 |
| 9.0 | 40.844 |
| 12.0 | 41.478 |
| 15.0 | 41.724 |
| 18.0 | 42.212 |
| 21.0 | 42.356 |
| 24.0 | 42.777 |
| 27.0 | 43.122 |
| 30.0 | 43.18 |
| 33.0 | 43.368 |
| 36.0 | 43.405 |
| 6.0 | 39.684 |
| 9.0 | 40.198 |
| 12.0 | 40.939 |
| 15.0 | 41.475 |
| 18.0 | 41.691 |
| 21.0 | 41.858 |
| 24.0 | 42.308 |
| 27.0 | 42.403 |
| 30.0 | 42.762 |
| 33.0 | 43.103 |
| 36.0 | 43.149 |
| 6.0 | 39.208 |
| 9.0 | 39.708 |
| 12.0 | 40.346 |
| 15.0 | 41.281 |
| 18.0 | 41.489 |
| 21.0 | 41.705 |
| 24.0 | 42.15 |
| 27.0 | 42.247 |
| 30.0 | 42.335 |
| 33.0 | 42.414 |
| 36.0 | 42.748 |
| 6.0 | 39.043 |
| 9.0 | 39.758 |
| 12.0 | 40.382 |
| 15.0 | 40.689 |
| 18.0 | 41.601 |
| 21.0 | 41.796 |
| 24.0 | 41.969 |
| 27.0 | 42.065 |
| 30.0 | 42.476 |
| 33.0 | 42.535 |
| 36.0 | 42.612 |
| 6.0 | 38.915 |
| 9.0 | 39.614 |
| 12.0 | 40.205 |
| 15.0 | 40.511 |
| 18.0 | 40.765 |
| 21.0 | 41.353 |
| 24.0 | 41.816 |
| 27.0 | 41.933 |
| 30.0 | 42.044 |
| 33.0 | 42.447 |
| 36.0 | 42.505 |
| 6.0 | 38.812 |
| 9.0 | 39.471 |
| 12.0 | 39.792 |
| 15.0 | 40.31 |
| 18.0 | 40.606 |
| 21.0 | 41.182 |
| 24.0 | 41.305 |
| 27.0 | 41.8 |
| 30.0 | 41.896 |
| 33.0 | 42.014 |
| 36.0 | 42.412 |
| 6.0 | 38.676 |
| 9.0 | 39.337 |
| 12.0 | 39.66 |
| 15.0 | 40.192 |
| 18.0 | 40.451 |
| 21.0 | 40.682 |
| 24.0 | 41.166 |
| 27.0 | 41.676 |
| 30.0 | 41.776 |
| 33.0 | 41.891 |
| 36.0 | 41.987 |
| 6.0 | 38.623 |
| 9.0 | 39.213 |
| 12.0 | 39.535 |
| 15.0 | 40.042 |
| 18.0 | 40.303 |
| 21.0 | 40.539 |
| 24.0 | 40.735 |
| 27.0 | 40.886 |
| 30.0 | 41.668 |
| 33.0 | 41.777 |
| 36.0 | 41.88 |
| 6.0 | 38.549 |
| 9.0 | 39.121 |
| 12.0 | 39.444 |
| 15.0 | 39.938 |
| 18.0 | 40.175 |
| 21.0 | 40.378 |
| 24.0 | 40.609 |
| 27.0 | 40.774 |
| 30.0 | 41.172 |
| 33.0 | 41.669 |
| 36.0 | 41.768 |
| 6.0 | 41.801 |
| 9.0 | 42.354 |
| 12.0 | 42.436 |
| 15.0 | 42.552 |
| 18.0 | 42.621 |
| 21.0 | 42.728 |
| 24.0 | 42.77 |
| 27.0 | 42.775 |
| 30.0 | 42.787 |
| 33.0 | 42.795 |
| 36.0 | 42.808 |
| 6.0 | 40.906 |
| 9.0 | 41.915 |
| 12.0 | 42.115 |
| 15.0 | 42.474 |
| 18.0 | 42.911 |
| 21.0 | 43.038 |
| 24.0 | 43.108 |
| 27.0 | 43.135 |
| 30.0 | 43.232 |
| 33.0 | 43.234 |
| 36.0 | 43.263 |
| 6.0 | 40.328 |
| 9.0 | 41.101 |
| 12.0 | 42.068 |
| 15.0 | 42.249 |
| 18.0 | 42.949 |
| 21.0 | 43.106 |
| 24.0 | 43.185 |
| 27.0 | 43.562 |
| 30.0 | 43.586 |
| 33.0 | 43.605 |
| 36.0 | 43.642 |
| 6.0 | 39.941 |
| 9.0 | 40.753 |
| 12.0 | 41.462 |
| 15.0 | 41.677 |
| 18.0 | 42.167 |
| 21.0 | 42.342 |
| 24.0 | 42.757 |
| 27.0 | 43.111 |
| 30.0 | 43.162 |
| 33.0 | 43.198 |
| 36.0 | 43.394 |
| 6.0 | 39.65 |
| 9.0 | 40.148 |
| 12.0 | 40.839 |
| 15.0 | 41.442 |
| 18.0 | 41.622 |
| 21.0 | 42.146 |
| 24.0 | 42.293 |
| 27.0 | 42.38 |
| 30.0 | 42.444 |
| 33.0 | 42.797 |
| 36.0 | 43.125 |
| 6.0 | 38.899 |
| 9.0 | 39.917 |
| 12.0 | 40.309 |
| 15.0 | 40.58 |
| 18.0 | 41.43 |
| 21.0 | 41.672 |
| 24.0 | 42.117 |
| 27.0 | 42.224 |
| 30.0 | 42.318 |
| 33.0 | 42.386 |
| 36.0 | 42.724 |
| 6.0 | 38.765 |
| 9.0 | 39.422 |
| 12.0 | 40.091 |
| 15.0 | 40.396 |
| 18.0 | 41.26 |
| 21.0 | 41.501 |
| 24.0 | 41.674 |
| 27.0 | 41.763 |
| 30.0 | 42.188 |
| 33.0 | 42.245 |
| 36.0 | 42.305 |
| 6.0 | 38.645 |
| 9.0 | 39.293 |
| 12.0 | 39.917 |
| 15.0 | 40.198 |
| 18.0 | 40.439 |
| 21.0 | 40.975 |
| 24.0 | 41.526 |
| 27.0 | 41.643 |
| 30.0 | 41.741 |
| 33.0 | 42.145 |
| 36.0 | 42.203 |
| 6.0 | 38.536 |
| 9.0 | 39.144 |
| 12.0 | 39.745 |
| 15.0 | 40.015 |
| 18.0 | 40.269 |
| 21.0 | 40.518 |
| 24.0 | 41.001 |
| 27.0 | 41.51 |
| 30.0 | 41.613 |
| 33.0 | 41.708 |
| 36.0 | 42.104 |
| 6.0 | 38.405 |
| 9.0 | 39.026 |
| 12.0 | 39.341 |
| 15.0 | 39.889 |
| 18.0 | 40.107 |
| 21.0 | 40.392 |
| 24.0 | 40.578 |
| 27.0 | 41.371 |
| 30.0 | 41.492 |
| 33.0 | 41.584 |
| 36.0 | 41.676 |
| 6.0 | 38.334 |
| 9.0 | 38.674 |
| 12.0 | 39.217 |
| 15.0 | 39.739 |
| 18.0 | 39.976 |
| 21.0 | 40.228 |
| 24.0 | 40.458 |
| 27.0 | 40.59 |
| 30.0 | 41.375 |
| 33.0 | 41.482 |
| 36.0 | 41.571 |
| 6.0 | 38.247 |
| 9.0 | 38.584 |
| 12.0 | 39.116 |
| 15.0 | 39.629 |
| 18.0 | 39.843 |
| 21.0 | 40.092 |
| 24.0 | 40.32 |
| 27.0 | 40.488 |
| 30.0 | 40.587 |
| 33.0 | 40.998 |
| 36.0 | 41.468 |